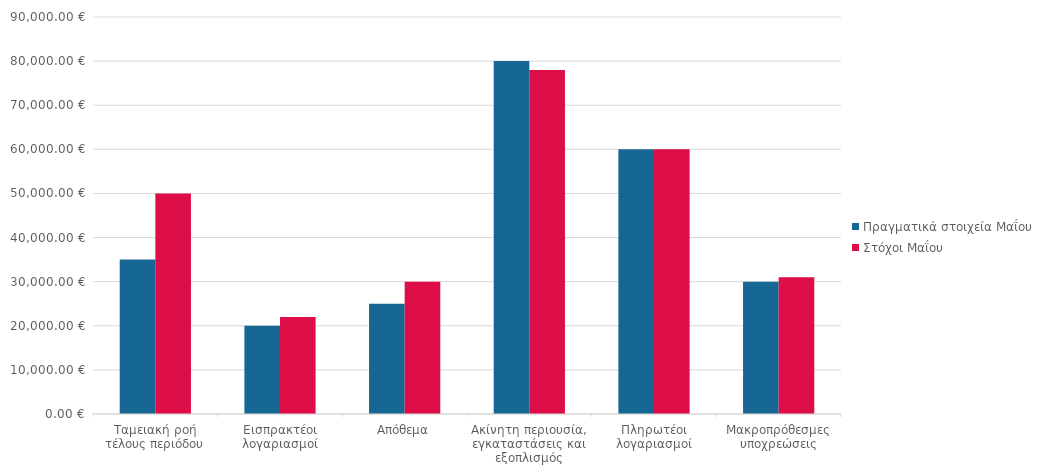
| Category | Πραγματικά στοιχεία Μαΐου | Στόχοι Μαΐου |
|---|---|---|
| Ταμειακή ροή τέλους περιόδου | 35000 | 50000 |
| Εισπρακτέοι λογαριασμοί | 20000 | 22000 |
| Απόθεμα | 25000 | 30000 |
| Ακίνητη περιουσία, εγκαταστάσεις και εξοπλισμός | 80000 | 78000 |
| Πληρωτέοι λογαριασμοί | 60000 | 60000 |
| Μακροπρόθεσμες υποχρεώσεις | 30000 | 31000 |